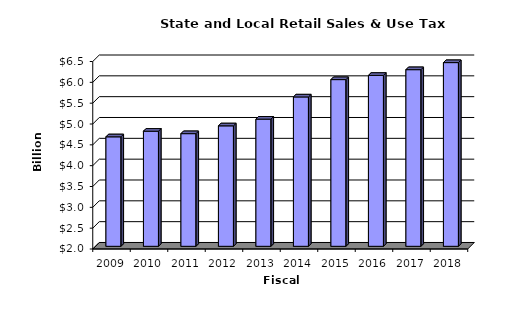
| Category | Series 0 |
|---|---|
| 2009.0 | 4.628 |
| 2010.0 | 4.762 |
| 2011.0 | 4.704 |
| 2012.0 | 4.891 |
| 2013.0 | 5.052 |
| 2014.0 | 5.585 |
| 2015.0 | 6.001 |
| 2016.0 | 6.102 |
| 2017.0 | 6.24 |
| 2018.0 | 6.409 |